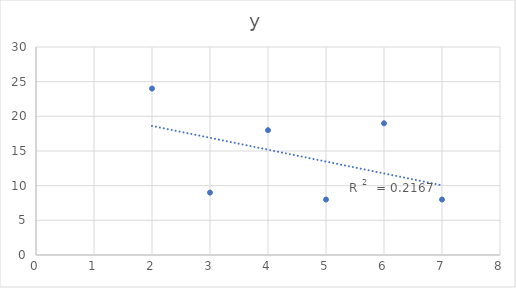
| Category | y |
|---|---|
| 2.0 | 24 |
| 3.0 | 9 |
| 4.0 | 18 |
| 5.0 | 8 |
| 6.0 | 19 |
| 7.0 | 8 |